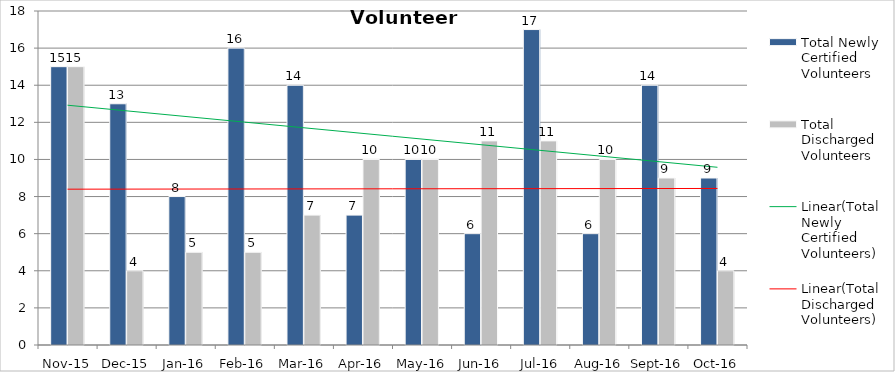
| Category | Total Newly Certified Volunteers | Total Discharged Volunteers |
|---|---|---|
| Nov-15 | 15 | 15 |
| Dec-15 | 13 | 4 |
| Jan-16 | 8 | 5 |
| Feb-16 | 16 | 5 |
| Mar-16 | 14 | 7 |
| Apr-16 | 7 | 10 |
| May-16 | 10 | 10 |
| Jun-16 | 6 | 11 |
| Jul-16 | 17 | 11 |
| Aug-16 | 6 | 10 |
| Sep-16 | 14 | 9 |
| Oct-16 | 9 | 4 |